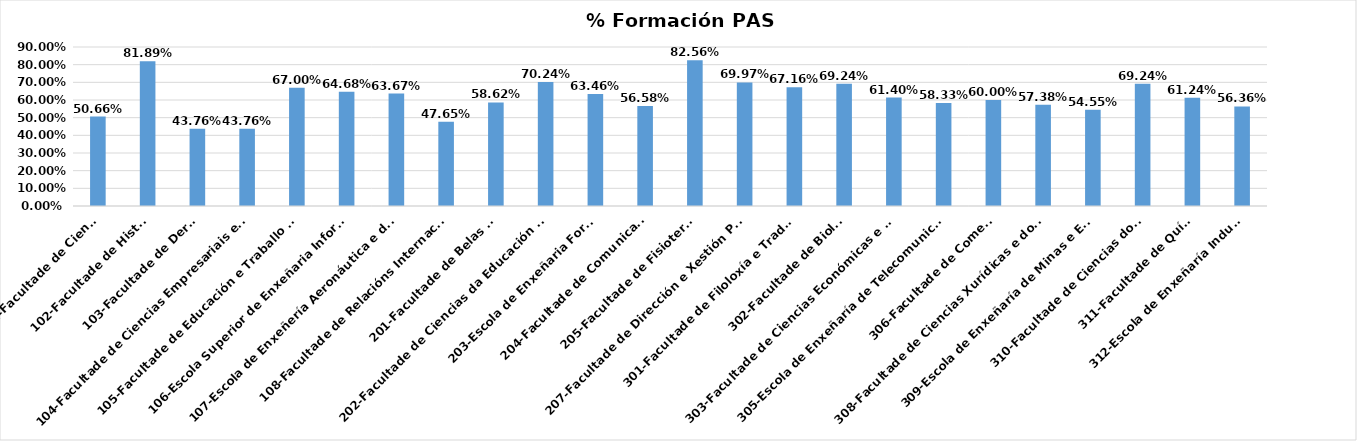
| Category | Series 0 |
|---|---|
| 101-Facultade de Ciencias | 0.507 |
| 102-Facultade de Historia | 0.819 |
| 103-Facultade de Dereito | 0.438 |
| 104-Facultade de Ciencias Empresariais e Turismo | 0.438 |
| 105-Facultade de Educación e Traballo Social | 0.67 |
| 106-Escola Superior de Enxeñaria Informática | 0.647 |
| 107-Escola de Enxeñería Aeronáutica e do Espazo | 0.637 |
| 108-Facultade de Relacións Internacionais | 0.476 |
| 201-Facultade de Belas Artes | 0.586 |
| 202-Facultade de Ciencias da Educación e do Deporte | 0.702 |
| 203-Escola de Enxeñaria Forestal | 0.635 |
| 204-Facultade de Comunicación | 0.566 |
| 205-Facultade de Fisioterapia | 0.826 |
| 207-Facultade de Dirección e Xestión Pública | 0.7 |
| 301-Facultade de Filoloxía e Traducción | 0.672 |
| 302-Facultade de Bioloxía | 0.692 |
| 303-Facultade de Ciencias Económicas e Empresariais | 0.614 |
| 305-Escola de Enxeñaría de Telecomunicacións | 0.583 |
| 306-Facultade de Comercio | 0.6 |
| 308-Facultade de Ciencias Xurídicas e do Traballo | 0.574 |
| 309-Escola de Enxeñaría de Minas e Enerxía | 0.546 |
| 310-Facultade de Ciencias do Mar | 0.692 |
| 311-Facultade de Química | 0.612 |
| 312-Escola de Enxeñaría Industrial | 0.564 |